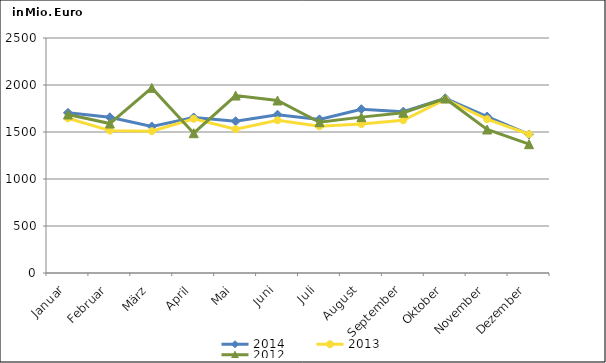
| Category | 2014 | 2013 | 2012 |
|---|---|---|---|
| Januar | 1704.053 | 1645.618 | 1686.373 |
| Februar | 1656.484 | 1514.603 | 1589.998 |
| März | 1558.399 | 1508.683 | 1969.441 |
| April | 1654.604 | 1641.027 | 1487.262 |
| Mai | 1614.266 | 1529.369 | 1887.848 |
| Juni | 1683.936 | 1624.951 | 1835.079 |
| Juli | 1634.249 | 1561.548 | 1604.071 |
| August | 1742.811 | 1584.449 | 1658.161 |
| September | 1716.646 | 1624.959 | 1704.746 |
| Oktober | 1858.769 | 1846.311 | 1855.892 |
| November | 1664.745 | 1636.355 | 1526.57 |
| Dezember | 1474 | 1476.287 | 1370.533 |